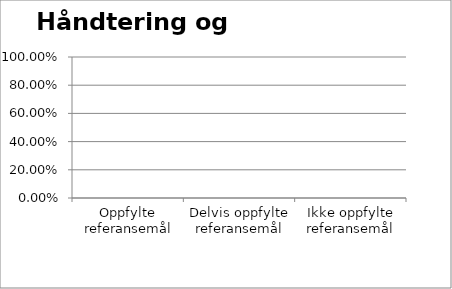
| Category | Håndtering og bruk |
|---|---|
| Oppfylte referansemål | 0 |
| Delvis oppfylte referansemål | 0 |
| Ikke oppfylte referansemål | 0 |